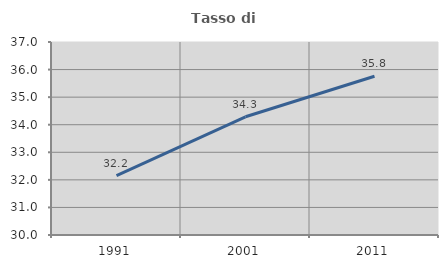
| Category | Tasso di occupazione   |
|---|---|
| 1991.0 | 32.152 |
| 2001.0 | 34.287 |
| 2011.0 | 35.757 |